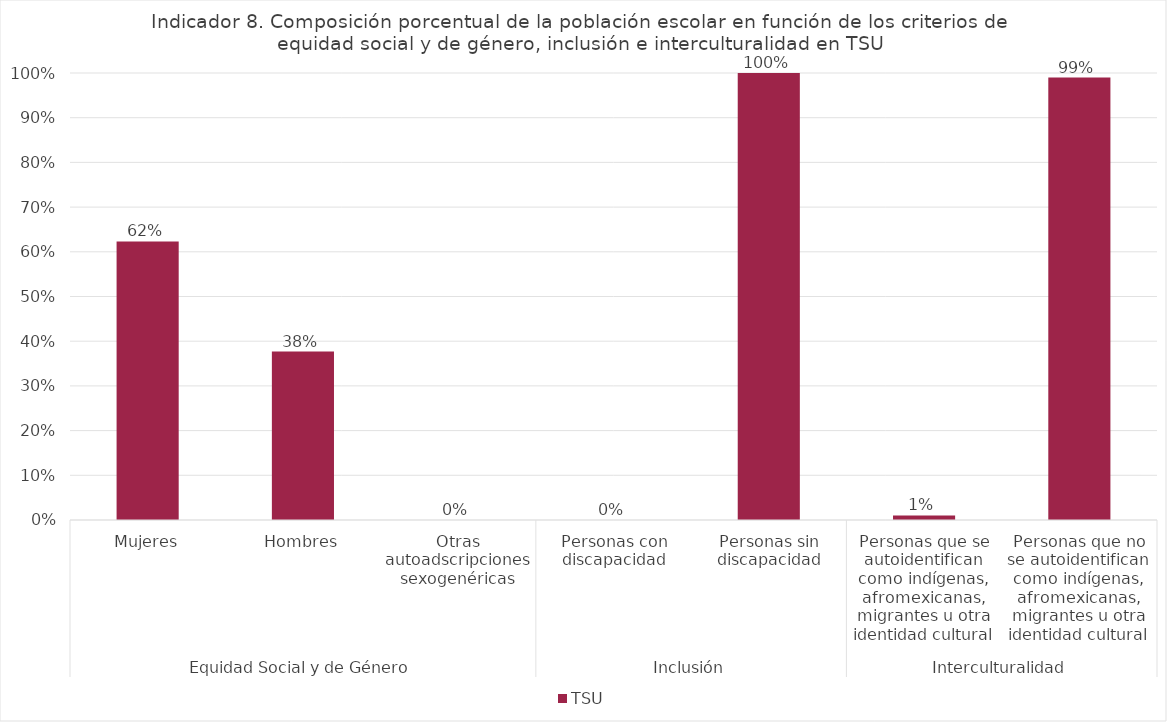
| Category | TSU |
|---|---|
| 0 | 0.623 |
| 1 | 0.377 |
| 2 | 0 |
| 3 | 0 |
| 4 | 1 |
| 5 | 0.01 |
| 6 | 0.99 |